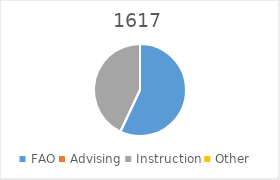
| Category | 1617 |
|---|---|
| FAO | 0.57 |
| Advising | 0 |
| Instruction | 0.43 |
| Other | 0 |